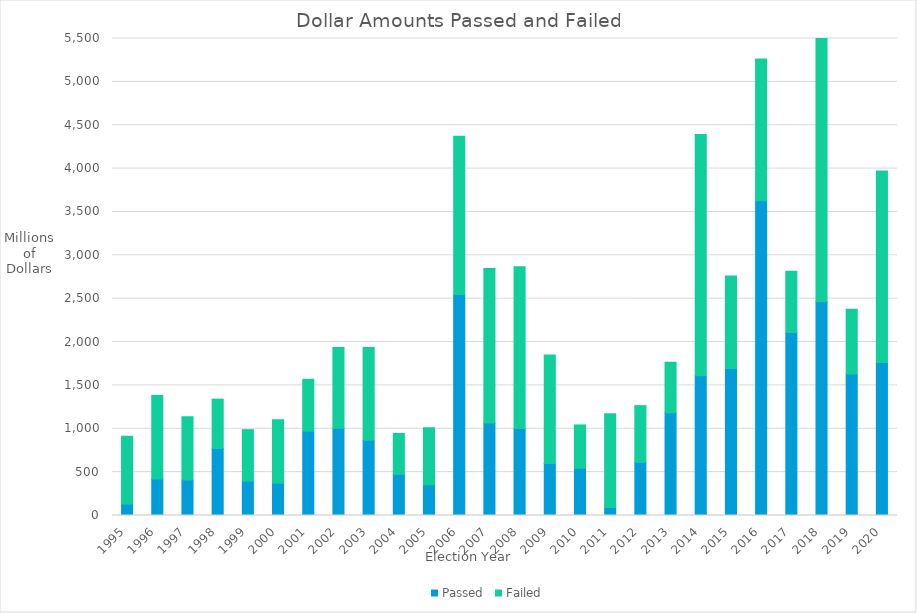
| Category | Passed | Failed |
|---|---|---|
| 1995 | 131450000 | 783561487 |
| 1996 | 421404000 | 962286422 |
| 1997 | 408240000 | 729243606 |
| 1998 | 772752508 | 568890944 |
| 1999 | 396513000 | 593285497 |
| 2000 | 372854664 | 732265400 |
| 2001 | 971542500 | 598994564 |
| 2002 | 1006632066 | 930412984 |
| 2003 | 867987062 | 1068890777 |
| 2004 | 474388785 | 471257658 |
| 2005 | 355215839 | 656797586 |
| 2006 | 2548648970 | 1823933514 |
| 2007 | 1066782891 | 1781442844 |
| 2008 | 1002122000 | 1865605845 |
| 2009 | 600896550 | 1248876038 |
| 2010 | 544995000 | 499160000 |
| 2011 | 91490000 | 1082909702 |
| 2012 | 613531500 | 653475000 |
| 2013 | 1184837000 | 582293791 |
| 2014 | 1611200000 | 2781466156 |
| 2015 | 1696275474 | 1065535121 |
| 2016 | 3627959242 | 1636352563 |
| 2017 | 2110180773 | 706239039 |
| 2018 | 2463462812 | 3322431861 |
| 2019 | 1632908000 | 745700000 |
| 2020 | 1764800000 | 2207165000 |